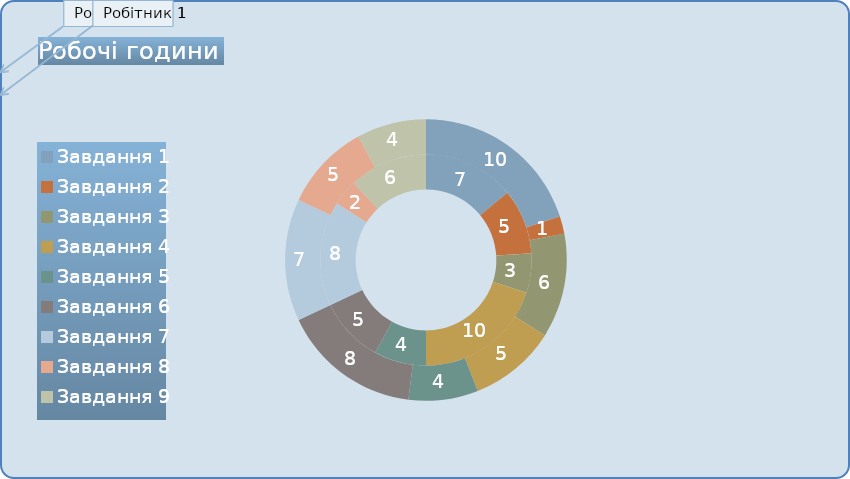
| Category | Робітник 1 (год.) | Робітник 2 (год.) |
|---|---|---|
| Завдання 1 | 7 | 10 |
| Завдання 2 | 5 | 1 |
| Завдання 3 | 3 | 6 |
| Завдання 4 | 10 | 5 |
| Завдання 5 | 4 | 4 |
| Завдання 6 | 5 | 8 |
| Завдання 7 | 8 | 7 |
| Завдання 8 | 2 | 5 |
| Завдання 9 | 6 | 4 |